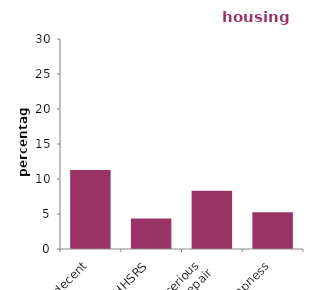
| Category | housing association |
|---|---|
| non decent | 11.29 |
| HHSRS | 4.366 |
| serious 
disrepair | 8.307 |
| dampness | 5.243 |